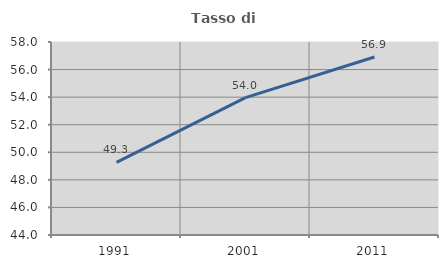
| Category | Tasso di occupazione   |
|---|---|
| 1991.0 | 49.269 |
| 2001.0 | 53.962 |
| 2011.0 | 56.915 |